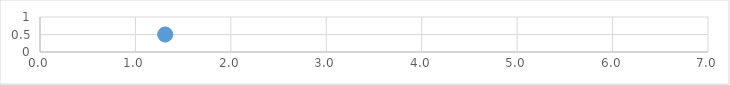
| Category | Series 0 |
|---|---|
| 1.3121582685186128 | 0.5 |